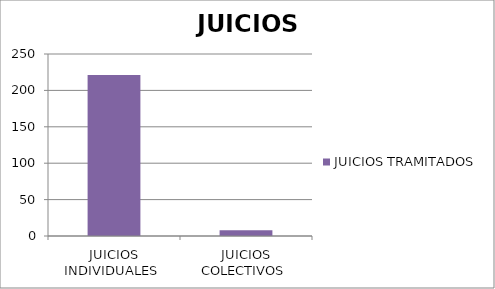
| Category | JUICIOS TRAMITADOS  |
|---|---|
| JUICIOS INDIVIDUALES  | 221 |
| JUICIOS COLECTIVOS  | 8 |